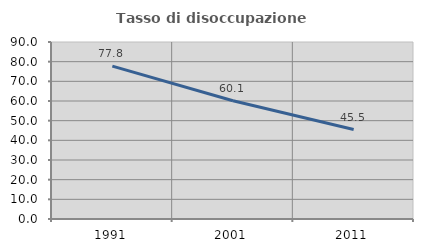
| Category | Tasso di disoccupazione giovanile  |
|---|---|
| 1991.0 | 77.757 |
| 2001.0 | 60.128 |
| 2011.0 | 45.493 |